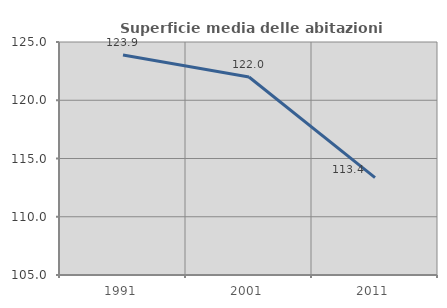
| Category | Superficie media delle abitazioni occupate |
|---|---|
| 1991.0 | 123.885 |
| 2001.0 | 121.992 |
| 2011.0 | 113.362 |